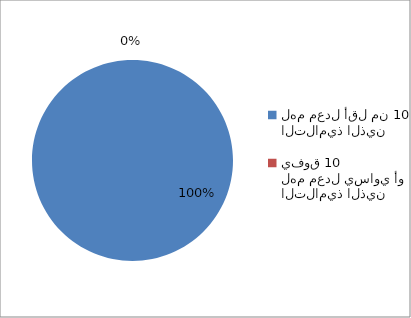
| Category | Series 0 |
|---|---|
| التلاميذ الذين لهم معدل أقل من 10 | 45 |
| التلاميذ الذين لهم معدل يساوي أو يفوق 10 | 0 |